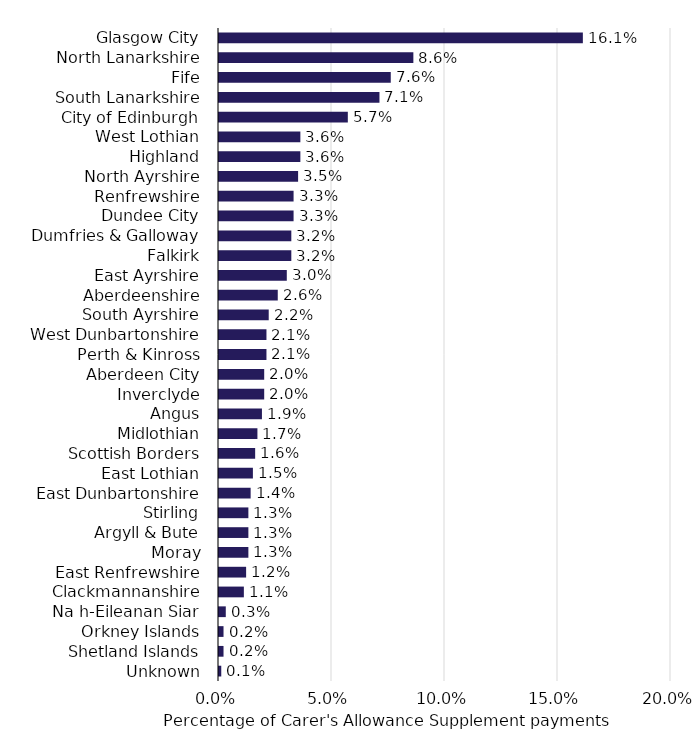
| Category | April Eligibiltiy |
|---|---|
| Glasgow City | 0.161 |
| North Lanarkshire | 0.086 |
| Fife | 0.076 |
| South Lanarkshire | 0.071 |
| City of Edinburgh | 0.057 |
| West Lothian | 0.036 |
| Highland | 0.036 |
| North Ayrshire | 0.035 |
| Renfrewshire | 0.033 |
| Dundee City | 0.033 |
| Dumfries & Galloway | 0.032 |
| Falkirk | 0.032 |
| East Ayrshire | 0.03 |
| Aberdeenshire | 0.026 |
| South Ayrshire | 0.022 |
| West Dunbartonshire | 0.021 |
| Perth & Kinross | 0.021 |
| Aberdeen City | 0.02 |
| Inverclyde | 0.02 |
| Angus | 0.019 |
| Midlothian | 0.017 |
| Scottish Borders | 0.016 |
| East Lothian | 0.015 |
| East Dunbartonshire | 0.014 |
| Stirling | 0.013 |
| Argyll & Bute | 0.013 |
| Moray | 0.013 |
| East Renfrewshire | 0.012 |
| Clackmannanshire | 0.011 |
| Na h-Eileanan Siar | 0.003 |
| Orkney Islands | 0.002 |
| Shetland Islands | 0.002 |
| Unknown | 0.001 |